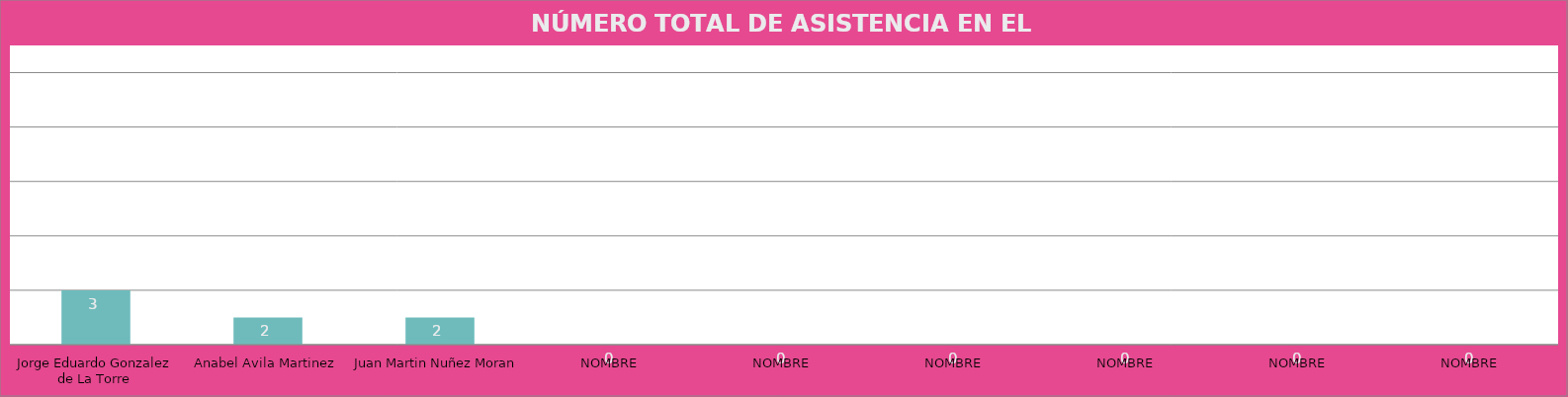
| Category | Jorge Eduardo Gonzalez de La Torre |
|---|---|
| Jorge Eduardo Gonzalez de La Torre | 3 |
| Anabel Avila Martinez | 2 |
| Juan Martin Nuñez Moran | 2 |
| NOMBRE | 0 |
| NOMBRE | 0 |
| NOMBRE | 0 |
| NOMBRE | 0 |
| NOMBRE | 0 |
| NOMBRE | 0 |